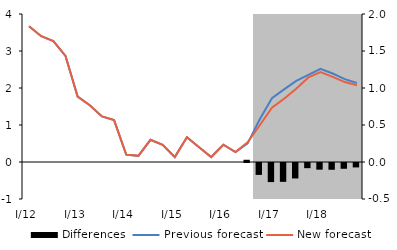
| Category | Differences |
|---|---|
| 0 | 0 |
| 1 | 0 |
| 2 | 0 |
| 3 | 0 |
| 4 | 0 |
| 5 | 0 |
| 6 | 0 |
| 7 | 0 |
| 8 | 0 |
| 9 | 0 |
| 10 | 0 |
| 11 | 0 |
| 12 | 0 |
| 13 | 0 |
| 14 | 0 |
| 15 | 0 |
| 16 | 0 |
| 17 | 0 |
| 18 | 0.03 |
| 19 | -0.161 |
| 20 | -0.258 |
| 21 | -0.254 |
| 22 | -0.209 |
| 23 | -0.07 |
| 24 | -0.09 |
| 25 | -0.092 |
| 26 | -0.078 |
| 27 | -0.06 |